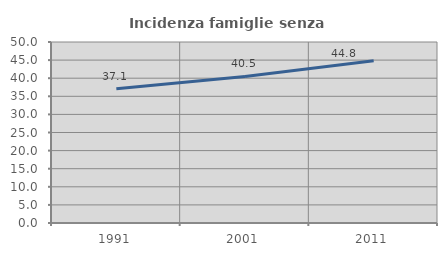
| Category | Incidenza famiglie senza nuclei |
|---|---|
| 1991.0 | 37.104 |
| 2001.0 | 40.476 |
| 2011.0 | 44.811 |